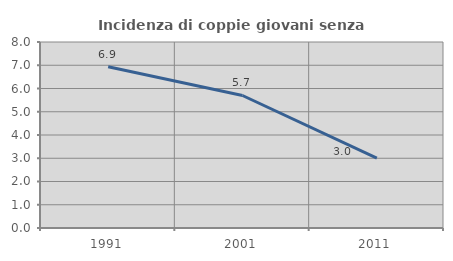
| Category | Incidenza di coppie giovani senza figli |
|---|---|
| 1991.0 | 6.937 |
| 2001.0 | 5.699 |
| 2011.0 | 3.005 |